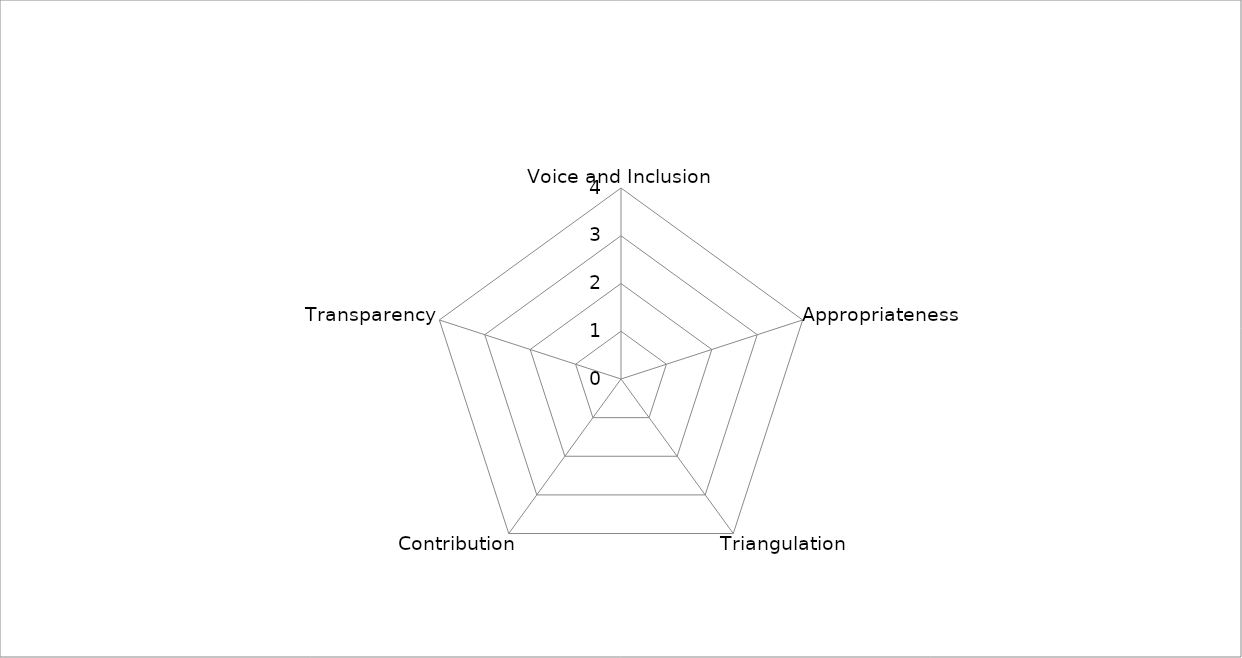
| Category | Series 0 |
|---|---|
| Voice and Inclusion | 0 |
| Appropriateness | 0 |
| Triangulation | 0 |
| Contribution | 0 |
| Transparency | 0 |